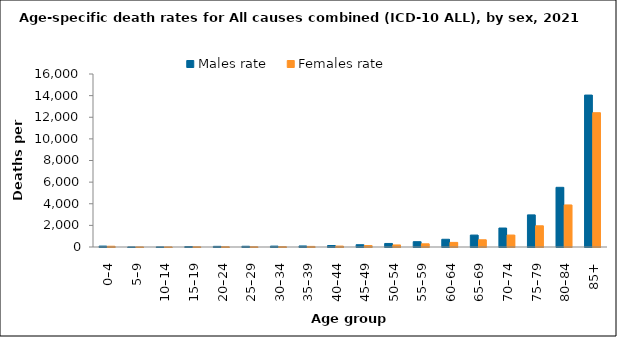
| Category | Males rate | Females rate |
|---|---|---|
| 0–4 | 83.86 | 69.514 |
| 5–9 | 7.937 | 6.75 |
| 10–14 | 11.012 | 7.864 |
| 15–19 | 42.78 | 19.509 |
| 20–24 | 59.49 | 25.818 |
| 25–29 | 67.834 | 25.564 |
| 30–34 | 81.444 | 33.99 |
| 35–39 | 96.311 | 55.05 |
| 40–44 | 137.886 | 84.783 |
| 45–49 | 211.06 | 131.975 |
| 50–54 | 326.762 | 190.36 |
| 55–59 | 491.647 | 295.57 |
| 60–64 | 714.856 | 426.089 |
| 65–69 | 1102.93 | 667.667 |
| 70–74 | 1755.389 | 1106.268 |
| 75–79 | 2969.766 | 1961.355 |
| 80–84 | 5519.639 | 3889.374 |
| 85+ | 14050.58 | 12421.837 |